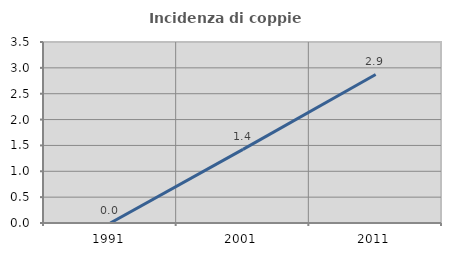
| Category | Incidenza di coppie miste |
|---|---|
| 1991.0 | 0 |
| 2001.0 | 1.425 |
| 2011.0 | 2.872 |